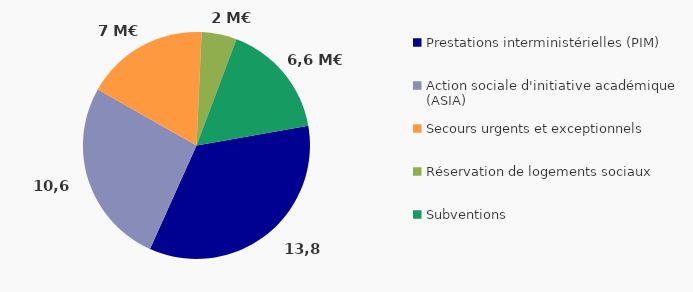
| Category | Series 0 |
|---|---|
| Prestations interministérielles (PIM) | 13.8 |
| Action sociale d'initiative académique (ASIA) | 10.6 |
| Secours urgents et exceptionnels | 7 |
| Réservation de logements sociaux | 2 |
| Subventions  | 6.6 |